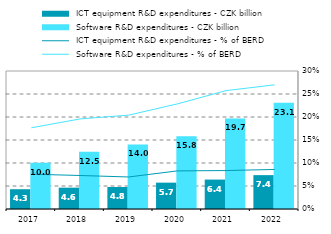
| Category |  ICT equipment R&D expenditures - CZK billion |  Software R&D expenditures - CZK billion |
|---|---|---|
| 2017.0 | 4.301 | 10.029 |
| 2018.0 | 4.637 | 12.464 |
| 2019.0 | 4.789 | 14.041 |
| 2020.0 | 5.725 | 15.792 |
| 2021.0 | 6.397 | 19.699 |
| 2022.0 | 7.361 | 23.108 |